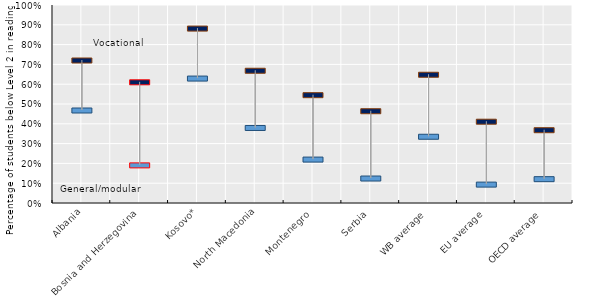
| Category | General/modular | Vocational | Middle |
|---|---|---|---|
| Albania | 0.47 | 0.722 | 0.596 |
| Bosnia and Herzegovina | 0.193 | 0.612 | 0.402 |
| Kosovo* | 0.631 | 0.883 | 0.757 |
| North Macedonia | 0.381 | 0.67 | 0.526 |
| Montenegro | 0.222 | 0.547 | 0.384 |
| Serbia | 0.126 | 0.466 | 0.296 |
| WB average | 0.337 | 0.65 | 0.494 |
| EU average | 0.095 | 0.413 | 0.254 |
| OECD average | 0.123 | 0.37 | 0.247 |